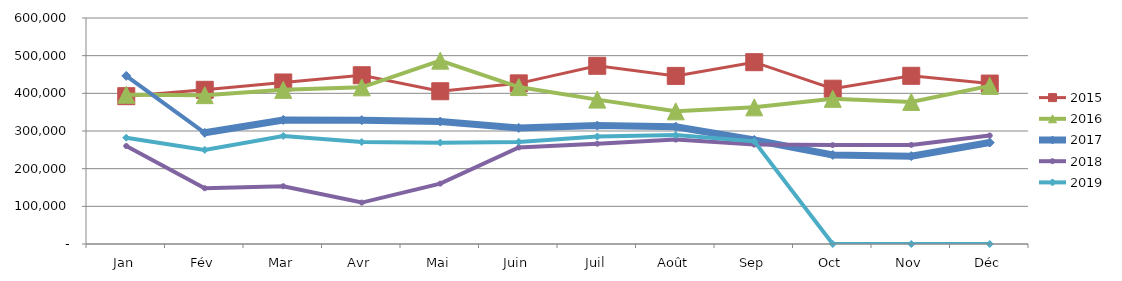
| Category | 2015 | 2016 | 2017 | 2018 | 2019 |
|---|---|---|---|---|---|
| Jan | 392455.386 | 396263.914 | 446281.806 | 260114.073 | 282172.738 |
| Fév | 409347.179 | 395175.975 | 295222.519 | 148036.843 | 249871.665 |
| Mar | 428838.698 | 409222.091 | 329338.872 | 153395.928 | 286777.302 |
| Avr | 448014.817 | 415901.642 | 328702.589 | 109982.902 | 270782.686 |
| Mai | 405528.286 | 486763.336 | 325158.457 | 160382.707 | 269027.301 |
| Juin | 426462.87 | 416602.613 | 308100.463 | 256426.409 | 271108.83 |
| Juil | 473107.942 | 383313.72 | 314407.38 | 266269.669 | 285234.508 |
| Août | 446267.927 | 352198.565 | 311304.785 | 277231.878 | 289072.19 |
| Sep | 482677.503 | 362763.978 | 276260.727 | 263963.731 | 272549.159 |
| Oct | 412311.701 | 385353.331 | 236379.756 | 262549.621 | 0 |
| Nov | 446526.169 | 377201.543 | 233251.128 | 263155.863 | 0 |
| Déc | 425963.85 | 419714.854 | 269424.356 | 287963.859 | 0 |